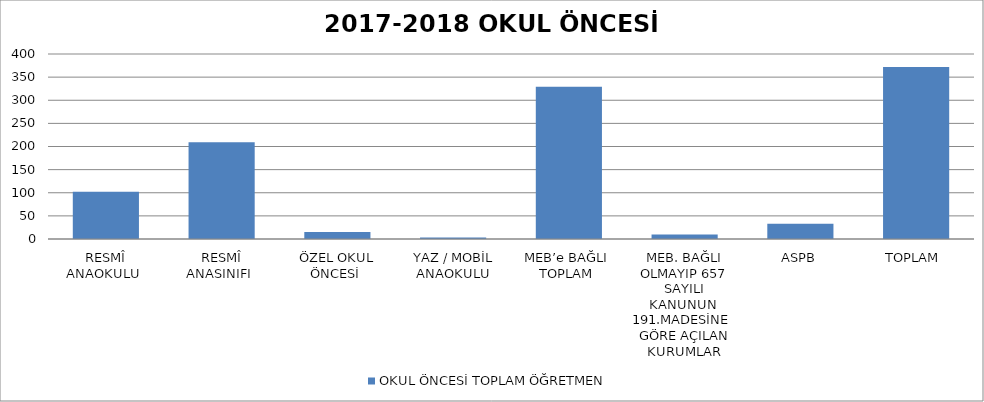
| Category | OKUL ÖNCESİ TOPLAM ÖĞRETMEN |
|---|---|
| RESMÎ ANAOKULU  | 102 |
| RESMÎ ANASINIFI  | 209 |
| ÖZEL OKUL ÖNCESİ  | 15 |
| YAZ / MOBİL ANAOKULU | 3 |
| MEB’e BAĞLI  TOPLAM  | 329 |
| MEB. BAĞLI OLMAYIP 657 SAYILI KANUNUN  191.MADESİNE  GÖRE AÇILAN KURUMLAR | 10 |
| ASPB | 33 |
| TOPLAM  | 372 |